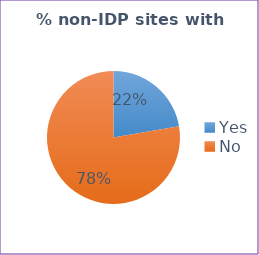
| Category | Total |
|---|---|
| Yes | 39 |
| No | 136 |